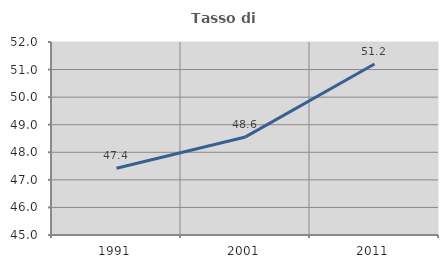
| Category | Tasso di occupazione   |
|---|---|
| 1991.0 | 47.424 |
| 2001.0 | 48.557 |
| 2011.0 | 51.202 |